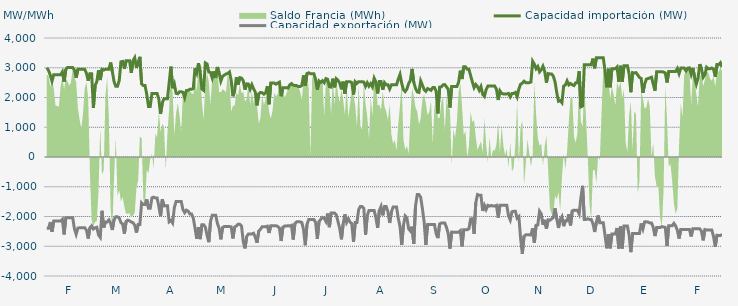
| Category | Capacidad importación (MW) | Capacidad exportación (MW) |
|---|---|---|
| 0 | 3000 | -2395.833 |
| 1900-01-01 | 2906.25 | -2395.833 |
| 1900-01-02 | 2750 | -2187.5 |
| 1900-01-03 | 2550 | -2512.5 |
| 1900-01-04 | 2766.667 | -2154.167 |
| 1900-01-05 | 2766.667 | -2154.167 |
| 1900-01-06 | 2766.667 | -2154.167 |
| 1900-01-07 | 2766.667 | -2154.167 |
| 1900-01-08 | 2766.667 | -2154.167 |
| 1900-01-09 | 2862.5 | -2093.75 |
| 1900-01-10 | 2529.167 | -2604.167 |
| 1900-01-11 | 2945.833 | -2041.667 |
| 1900-01-12 | 3008.333 | -2041.667 |
| 1900-01-13 | 3008.333 | -2041.667 |
| 1900-01-14 | 3008.333 | -2041.667 |
| 1900-01-15 | 3008.333 | -2041.667 |
| 1900-01-16 | 2922.917 | -2412.5 |
| 1900-01-17 | 2662.5 | -2600 |
| 1900-01-18 | 2945.833 | -2389.583 |
| 1900-01-19 | 2945.833 | -2377.083 |
| 1900-01-20 | 2945.833 | -2377.083 |
| 1900-01-21 | 2945.833 | -2377.083 |
| 1900-01-22 | 2945.833 | -2379.167 |
| 1900-01-23 | 2812.5 | -2462.5 |
| 1900-01-24 | 2562.5 | -2741.667 |
| 1900-01-25 | 2802.083 | -2377.083 |
| 1900-01-26 | 2800 | -2312.5 |
| 1900-01-27 | 1650 | -2420.833 |
| 1900-01-28 | 2400 | -2379.167 |
| 1900-01-29 | 2533.333 | -2362.5 |
| 1900-01-30 | 2918.75 | -2622.917 |
| 1900-01-31 | 2587.5 | -2702.083 |
| 1900-02-01 | 2947.917 | -1808.333 |
| 1900-02-02 | 2922.917 | -2372.917 |
| 1900-02-03 | 2947.917 | -2181.25 |
| 1900-02-04 | 2947.917 | -2181.25 |
| 1900-02-05 | 2947.917 | -2114.583 |
| 1900-02-06 | 3175 | -2225 |
| 1900-02-07 | 2875 | -2454.167 |
| 1900-02-08 | 2535.417 | -2108.333 |
| 1900-02-09 | 2375 | -2012.5 |
| 1900-02-10 | 2375 | -2012.5 |
| 1900-02-11 | 2566.667 | -2043.75 |
| 1900-02-12 | 3200 | -2208.333 |
| 1900-02-13 | 3212.5 | -2250 |
| 1900-02-14 | 2962.5 | -2579.167 |
| 1900-02-15 | 3233.333 | -2166.667 |
| 1900-02-16 | 3233.333 | -2122.917 |
| 1900-02-17 | 3233.333 | -2145.833 |
| 1900-02-18 | 2829.167 | -2185.417 |
| 1900-02-19 | 3233.333 | -2208.333 |
| 1900-02-20 | 3337.5 | -2293.75 |
| 1900-02-21 | 2991.304 | -2541.304 |
| 1900-02-22 | 3183.333 | -2268.75 |
| 1900-02-23 | 3366.667 | -2268.75 |
| 1900-02-24 | 2454.583 | -1541.667 |
| 1900-02-25 | 2400 | -1600 |
| 1900-02-26 | 2400 | -1600 |
| 1900-02-27 | 2100 | -1425 |
| 1900-02-28 | 1700 | -1725 |
| 1900-02-28 | 1700 | -1725 |
| 1900-03-01 | 2133.333 | -1375 |
| 1900-03-02 | 2133.333 | -1350 |
| 1900-03-03 | 2133.333 | -1375 |
| 1900-03-04 | 2133.333 | -1375 |
| 1900-03-05 | 1943.75 | -1662.5 |
| 1900-03-06 | 1447.917 | -1991.667 |
| 1900-03-07 | 1820.833 | -1420.833 |
| 1900-03-08 | 1958.333 | -1645.833 |
| 1900-03-09 | 1958.333 | -1637.5 |
| 1900-03-10 | 1958.333 | -1637.5 |
| 1900-03-11 | 2502.083 | -2177.083 |
| 1900-03-12 | 3037.5 | -2129.167 |
| 1900-03-13 | 2312.5 | -2216.667 |
| 1900-03-14 | 2456.25 | -1702.083 |
| 1900-03-15 | 2141.667 | -1497.917 |
| 1900-03-16 | 2125 | -1497.917 |
| 1900-03-17 | 2191.667 | -1497.917 |
| 1900-03-18 | 2191.667 | -1497.917 |
| 1900-03-19 | 2175 | -1766.667 |
| 1900-03-20 | 1997.917 | -1870.833 |
| 1900-03-21 | 2233.333 | -1787.5 |
| 1900-03-22 | 2241.667 | -1818.75 |
| 1900-03-23 | 2275 | -1914.583 |
| 1900-03-24 | 2275 | -1914.583 |
| 1900-03-25 | 2304.167 | -2052.083 |
| 1900-03-26 | 2979.167 | -2385.417 |
| 1900-03-27 | 2825 | -2752.083 |
| 1900-03-28 | 3154.167 | -2358.333 |
| 1900-03-29 | 2850 | -2760.417 |
| 1900-03-30 | 2285.417 | -2275 |
| 1900-03-31 | 2239.583 | -2275 |
| 1900-04-01 | 3162.5 | -2358.333 |
| 1900-04-02 | 3127.083 | -2631.25 |
| 1900-04-03 | 2858.333 | -2862.5 |
| 1900-04-04 | 2841.667 | -2166.667 |
| 1900-04-05 | 2656.25 | -1956.25 |
| 1900-04-06 | 2883.333 | -1956.25 |
| 1900-04-07 | 2656.25 | -1956.25 |
| 1900-04-08 | 3025 | -2229.167 |
| 1900-04-09 | 2831.25 | -2393.75 |
| 1900-04-10 | 2550.625 | -2766.667 |
| 1900-04-11 | 2710.417 | -2368.75 |
| 1900-04-12 | 2754.167 | -2337.5 |
| 1900-04-13 | 2791.667 | -2337.5 |
| 1900-04-14 | 2808.333 | -2337.5 |
| 1900-04-15 | 2858.333 | -2337.5 |
| 1900-04-16 | 2581.25 | -2347.917 |
| 1900-04-17 | 2041.667 | -2737.5 |
| 1900-04-18 | 2218.75 | -2354.167 |
| 1900-04-19 | 2679.167 | -2320.833 |
| 1900-04-20 | 2427.083 | -2260.417 |
| 1900-04-21 | 2666.667 | -2260.417 |
| 1900-04-22 | 2654.167 | -2320.833 |
| 1900-04-23 | 2562.5 | -2837.5 |
| 1900-04-24 | 2264.583 | -3070.833 |
| 1900-04-25 | 2458.333 | -2672.917 |
| 1900-04-26 | 2454.167 | -2585.417 |
| 1900-04-27 | 2279.167 | -2585.417 |
| 1900-04-28 | 2431.25 | -2585.417 |
| 1900-04-29 | 2295.833 | -2562.5 |
| 1900-04-30 | 2181.25 | -2700 |
| 1900-05-01 | 1735.417 | -2883.333 |
| 1900-05-02 | 2125 | -2487.5 |
| 1900-05-03 | 2170.833 | -2429.167 |
| 1900-05-04 | 2158.333 | -2341.667 |
| 1900-05-05 | 2112.5 | -2341.667 |
| 1900-05-06 | 2158.333 | -2341.667 |
| 1900-05-07 | 2383.333 | -2325 |
| 1900-05-08 | 1772.917 | -2554.167 |
| 1900-05-09 | 2485.417 | -2308.333 |
| 1900-05-10 | 2485.417 | -2308.333 |
| 1900-05-11 | 2485.417 | -2308.333 |
| 1900-05-12 | 2447.917 | -2308.333 |
| 1900-05-13 | 2485.417 | -2333.333 |
| 1900-05-14 | 2516.667 | -2387.5 |
| 1900-05-15 | 2043.75 | -2822.917 |
| 1900-05-16 | 2331.25 | -2362.5 |
| 1900-05-17 | 2331.25 | -2320.833 |
| 1900-05-18 | 2331.25 | -2320.833 |
| 1900-05-19 | 2318.75 | -2308.333 |
| 1900-05-20 | 2425 | -2320.833 |
| 1900-05-21 | 2468.75 | -2295.833 |
| 1900-05-22 | 2418.75 | -2772.917 |
| 1900-05-23 | 2400 | -2235.417 |
| 1900-05-24 | 2400 | -2179.167 |
| 1900-05-25 | 2366.667 | -2179.167 |
| 1900-05-26 | 2366.667 | -2179.167 |
| 1900-05-27 | 2404.167 | -2200 |
| 1900-05-28 | 2743.75 | -2437.5 |
| 1900-05-29 | 2393.75 | -2964.583 |
| 1900-05-30 | 2804.167 | -2270.833 |
| 1900-05-31 | 2829.167 | -2097.917 |
| 1900-06-01 | 2800 | -2097.917 |
| 1900-06-02 | 2800 | -2097.917 |
| 1900-06-03 | 2800 | -2097.917 |
| 1900-06-04 | 2610.417 | -2200 |
| 1900-06-05 | 2264.583 | -2750 |
| 1900-06-06 | 2556.25 | -2166.667 |
| 1900-06-07 | 2506.25 | -2095.833 |
| 1900-06-08 | 2564.583 | -2029.167 |
| 1900-06-09 | 2497.917 | -2058.333 |
| 1900-06-10 | 2635.417 | -2166.667 |
| 1900-06-11 | 2612.5 | -1900 |
| 1900-06-12 | 2362.5 | -2358.333 |
| 1900-06-13 | 2350 | -1885.417 |
| 1900-06-14 | 2633.333 | -1885.417 |
| 1900-06-15 | 2341.667 | -1885.417 |
| 1900-06-16 | 2633.333 | -1943.75 |
| 1900-06-17 | 2579.167 | -2168.75 |
| 1900-06-18 | 2485.417 | -2400 |
| 1900-06-19 | 2275 | -2766.667 |
| 1900-06-20 | 2533.333 | -2252.083 |
| 1900-06-21 | 2125 | -1929.167 |
| 1900-06-22 | 2533.333 | -2195.833 |
| 1900-06-23 | 2533.333 | -2072.917 |
| 1900-06-24 | 2533.333 | -2187.5 |
| 1900-06-25 | 2500 | -2237.5 |
| 1900-06-26 | 2100 | -2856.25 |
| 1900-06-27 | 2533.333 | -2202.083 |
| 1900-06-28 | 2475 | -2202.083 |
| 1900-06-29 | 2533.333 | -1768.75 |
| 1900-06-30 | 2533.333 | -1662.5 |
| 1900-07-01 | 2533.333 | -1662.5 |
| 1900-07-02 | 2518.75 | -1725 |
| 1900-07-03 | 2375 | -2614.583 |
| 1900-07-04 | 2495.833 | -1964.583 |
| 1900-07-05 | 2383.333 | -1800 |
| 1900-07-06 | 2466.667 | -1800 |
| 1900-07-07 | 2358.333 | -1800 |
| 1900-07-08 | 2650 | -1800 |
| 1900-07-09 | 2525 | -2037.5 |
| 1900-07-10 | 2135.417 | -2381.25 |
| 1900-07-11 | 2537.5 | -1800 |
| 1900-07-12 | 2537.5 | -1662.5 |
| 1900-07-13 | 2260.417 | -1960.417 |
| 1900-07-14 | 2500 | -1662.5 |
| 1900-07-15 | 2425 | -1662.5 |
| 1900-07-16 | 2425 | -1843.75 |
| 1900-07-17 | 2287.5 | -2216.667 |
| 1900-07-18 | 2425 | -1843.75 |
| 1900-07-19 | 2425 | -1681.25 |
| 1900-07-20 | 2425 | -1681.25 |
| 1900-07-21 | 2425 | -1681.25 |
| 1900-07-22 | 2616.667 | -2062.5 |
| 1900-07-23 | 2775 | -2329.167 |
| 1900-07-24 | 2475 | -2956.25 |
| 1900-07-25 | 2258.333 | -2293.75 |
| 1900-07-26 | 2200 | -1981.25 |
| 1900-07-27 | 2283.333 | -2043.75 |
| 1900-07-28 | 2466.667 | -2410.417 |
| 1900-07-29 | 2570.833 | -2485.417 |
| 1900-07-30 | 2962.5 | -2341.667 |
| 1900-07-31 | 2512.5 | -2920.833 |
| 1900-08-01 | 2308.333 | -1650 |
| 1900-08-02 | 2187.5 | -1262.5 |
| 1900-08-03 | 2170.833 | -1262.5 |
| 1900-08-04 | 2558.333 | -1352.083 |
| 1900-08-05 | 2416.667 | -1731.25 |
| 1900-08-06 | 2266.667 | -2175 |
| 1900-08-07 | 2208.333 | -2956.25 |
| 1900-08-08 | 2300 | -2268.75 |
| 1900-08-09 | 2275 | -2266.667 |
| 1900-08-10 | 2241.667 | -2266.667 |
| 1900-08-11 | 2333.333 | -2266.667 |
| 1900-08-12 | 2333.333 | -2270.833 |
| 1900-08-13 | 2212.5 | -2581.25 |
| 1900-08-14 | 1464.583 | -2725 |
| 1900-08-15 | 2350 | -2250 |
| 1900-08-16 | 2358.333 | -2218.75 |
| 1900-08-17 | 2425 | -2218.75 |
| 1900-08-18 | 2433.333 | -2218.75 |
| 1900-08-19 | 2354.167 | -2368.75 |
| 1900-08-20 | 2279.167 | -2575 |
| 1900-08-21 | 1662.5 | -3079.167 |
| 1900-08-22 | 2366.667 | -2522.917 |
| 1900-08-23 | 2366.667 | -2527.083 |
| 1900-08-24 | 2366.667 | -2527.083 |
| 1900-08-25 | 2366.667 | -2527.083 |
| 1900-08-26 | 2508.333 | -2527.083 |
| 1900-08-27 | 2900 | -2477.083 |
| 1900-08-28 | 2620.833 | -3004.167 |
| 1900-08-29 | 3033.333 | -2443.75 |
| 1900-08-30 | 3033.333 | -2443.75 |
| 1900-08-31 | 2950 | -2443.75 |
| 1900-09-01 | 2950 | -2410.417 |
| 1900-09-02 | 2735.417 | -2081.25 |
| 1900-09-03 | 2525 | -2075 |
| 1900-09-04 | 2332.667 | -2579.167 |
| 1900-09-05 | 2437.5 | -1537.5 |
| 1900-09-06 | 2366.667 | -1262.5 |
| 1900-09-07 | 2241.667 | -1287.5 |
| 1900-09-08 | 2366.667 | -1287.5 |
| 1900-09-09 | 2108.333 | -1814.583 |
| 1900-09-10 | 2039.583 | -1625 |
| 1900-09-11 | 2264.583 | -1762.5 |
| 1900-09-12 | 2383.333 | -1625 |
| 1900-09-13 | 2383.333 | -1650 |
| 1900-09-14 | 2383.333 | -1629.167 |
| 1900-09-15 | 2383.333 | -1650 |
| 1900-09-16 | 2383.333 | -1650 |
| 1900-09-17 | 2275 | -1625 |
| 1900-09-18 | 1918.75 | -2037.5 |
| 1900-09-19 | 2225 | -1625 |
| 1900-09-20 | 2138.417 | -1625 |
| 1900-09-21 | 2120.833 | -1625 |
| 1900-09-22 | 2120.833 | -1625 |
| 1900-09-23 | 2120.833 | -1625 |
| 1900-09-24 | 2137.5 | -1975 |
| 1900-09-25 | 2020 | -2116 |
| 1900-09-26 | 2137.5 | -1841.667 |
| 1900-09-27 | 2137.5 | -1825 |
| 1900-09-28 | 2170.833 | -1825 |
| 1900-09-29 | 2022.917 | -2054.167 |
| 1900-09-30 | 2287.5 | -2000 |
| 1900-10-01 | 2445.833 | -2731.25 |
| 1900-10-02 | 2481.25 | -3254.167 |
| 1900-10-03 | 2547.917 | -2662.5 |
| 1900-10-04 | 2500 | -2616.667 |
| 1900-10-05 | 2500 | -2616.667 |
| 1900-10-06 | 2500 | -2616.667 |
| 1900-10-07 | 2520.833 | -2620.833 |
| 1900-10-08 | 3218.75 | -2393.75 |
| 1900-10-09 | 3120.833 | -2885.417 |
| 1900-10-10 | 2966.667 | -2295.833 |
| 1900-10-11 | 3041.667 | -2281.25 |
| 1900-10-12 | 2862.5 | -1822.917 |
| 1900-10-13 | 2933.333 | -1914.583 |
| 1900-10-14 | 3050 | -2281.25 |
| 1900-10-15 | 2875 | -2112.5 |
| 1900-10-16 | 2500 | -2410.417 |
| 1900-10-17 | 2804.167 | -2112.5 |
| 1900-10-18 | 2791.667 | -2125 |
| 1900-10-19 | 2791.667 | -2083.333 |
| 1900-10-20 | 2716.667 | -2031.25 |
| 1900-10-21 | 2529.167 | -1727.083 |
| 1900-10-22 | 2162.5 | -2085.417 |
| 1900-10-23 | 1872.917 | -2385.417 |
| 1900-10-24 | 1897.917 | -2095.833 |
| 1900-10-25 | 1825 | -2002.083 |
| 1900-10-26 | 2383.333 | -2325 |
| 1900-10-27 | 2418.75 | -2145.833 |
| 1900-10-28 | 2558.333 | -2145.833 |
| 1900-10-29 | 2425 | -1925 |
| 1900-10-30 | 2470.833 | -2300 |
| 1900-10-31 | 2425 | -1808.333 |
| 1900-11-01 | 2400 | -1785.417 |
| 1900-11-02 | 2495.833 | -1795.833 |
| 1900-11-03 | 2497.917 | -1789.583 |
| 1900-11-04 | 2882.917 | -1912.5 |
| 1900-11-05 | 1685.417 | -1368.75 |
| 1900-11-06 | 1712.5 | -968.75 |
| 1900-11-07 | 3104.167 | -2100 |
| 1900-11-08 | 3104.167 | -2100 |
| 1900-11-09 | 3104.167 | -2075 |
| 1900-11-10 | 3104.167 | -2100 |
| 1900-11-11 | 3104.167 | -2100 |
| 1900-11-12 | 3306.25 | -2237.5 |
| 1900-11-13 | 2981.25 | -2520.833 |
| 1900-11-14 | 3333.333 | -2189.583 |
| 1900-11-15 | 3333.333 | -1964.583 |
| 1900-11-16 | 3333.333 | -2212.5 |
| 1900-11-17 | 3333.333 | -2212.5 |
| 1900-11-18 | 3333.333 | -2212.5 |
| 1900-11-19 | 2904.167 | -2625 |
| 1900-11-20 | 2343.75 | -3068.75 |
| 1900-11-21 | 2966.667 | -2589.583 |
| 1900-11-22 | 2343.75 | -3068.75 |
| 1900-11-23 | 2966.667 | -2589.583 |
| 1900-11-24 | 2966.667 | -2589.583 |
| 1900-11-25 | 2966.667 | -2589.583 |
| 1900-11-26 | 3025 | -2385.417 |
| 1900-11-27 | 2525 | -3075 |
| 1900-11-28 | 3066.667 | -2320.833 |
| 1900-11-29 | 2525 | -3075 |
| 1900-11-30 | 3066.667 | -2320.833 |
| 1900-12-01 | 3066.667 | -2320.833 |
| 1900-12-02 | 3066.667 | -2320.833 |
| 1900-12-03 | 2800 | -2622.917 |
| 1900-12-04 | 2177.083 | -3197.917 |
| 1900-12-05 | 2837.5 | -2568.75 |
| 1900-12-06 | 2820.833 | -2568.75 |
| 1900-12-07 | 2837.5 | -2568.75 |
| 1900-12-08 | 2758.333 | -2568.75 |
| 1900-12-09 | 2675 | -2568.75 |
| 1900-12-10 | 2641.667 | -2233.333 |
| 1900-12-11 | 2156.25 | -2418.75 |
| 1900-12-12 | 2450 | -2181.25 |
| 1900-12-13 | 2616.667 | -2179.167 |
| 1900-12-14 | 2637.5 | -2187.5 |
| 1900-12-15 | 2658.333 | -2216.667 |
| 1900-12-16 | 2683.333 | -2216.667 |
| 1900-12-17 | 2450 | -2362.5 |
| 1900-12-18 | 2231.25 | -2658.333 |
| 1900-12-19 | 2866.667 | -2372.917 |
| 1900-12-20 | 2866.667 | -2372.917 |
| 1900-12-21 | 2866.667 | -2372.917 |
| 1900-12-22 | 2866.667 | -2339.583 |
| 1900-12-23 | 2854.167 | -2352.083 |
| 1900-12-24 | 2825 | -2368.75 |
| 1900-12-25 | 2504.167 | -2991.667 |
| 1900-12-26 | 2875 | -2314.583 |
| 1900-12-27 | 2875 | -2314.583 |
| 1900-12-28 | 2875 | -2314.583 |
| 1900-12-29 | 2875 | -2231.25 |
| 1900-12-30 | 2875 | -2314.583 |
| 1900-12-31 | 2975 | -2462.5 |
| 1901-01-01 | 2802.083 | -2741.667 |
| 1901-01-02 | 2987.5 | -2433.333 |
| 1901-01-03 | 2987.5 | -2433.333 |
| 1901-01-04 | 2987.5 | -2433.333 |
| 1901-01-05 | 2893.75 | -2433.333 |
| 1901-01-06 | 2987.5 | -2433.333 |
| 1901-01-07 | 2995.833 | -2437.5 |
| 1901-01-08 | 2781.25 | -2670.833 |
| 1901-01-09 | 2993.75 | -2412.5 |
| 1901-01-10 | 2679.167 | -2412.5 |
| 1901-01-11 | 2450 | -2412.5 |
| 1901-01-12 | 2645.833 | -2412.5 |
| 1901-01-13 | 3120.833 | -2412.5 |
| 1901-01-14 | 2958.333 | -2495.833 |
| 1901-01-15 | 2681.25 | -2802.083 |
| 1901-01-16 | 2768.75 | -2439.583 |
| 1901-01-17 | 3016.667 | -2456.25 |
| 1901-01-18 | 2966.667 | -2454.167 |
| 1901-01-19 | 2966.667 | -2452.083 |
| 1901-01-20 | 2991.667 | -2454.167 |
| 1901-01-21 | 2952.083 | -2670.833 |
| 1901-01-22 | 2697.917 | -3016.667 |
| 1901-01-23 | 3108.333 | -2631.25 |
| 1901-01-24 | 3100 | -2637.5 |
| 1901-01-25 | 3166.667 | -2637.5 |
| 1901-01-26 | 3025 | -2604.167 |